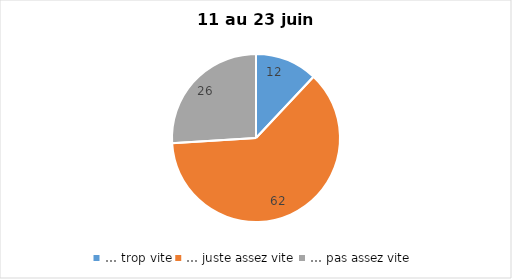
| Category | Series 0 |
|---|---|
| … trop vite | 12 |
| … juste assez vite | 62 |
| … pas assez vite | 26 |